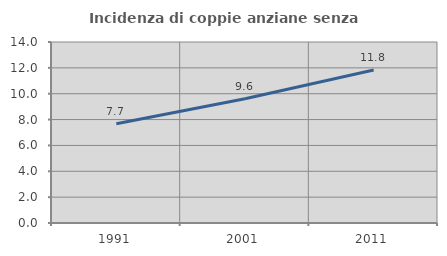
| Category | Incidenza di coppie anziane senza figli  |
|---|---|
| 1991.0 | 7.67 |
| 2001.0 | 9.615 |
| 2011.0 | 11.834 |